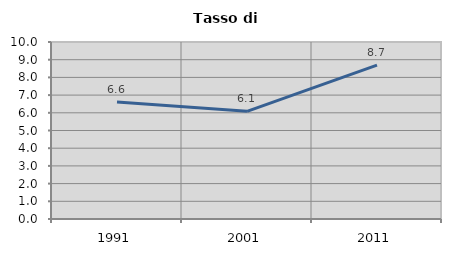
| Category | Tasso di disoccupazione   |
|---|---|
| 1991.0 | 6.616 |
| 2001.0 | 6.081 |
| 2011.0 | 8.691 |